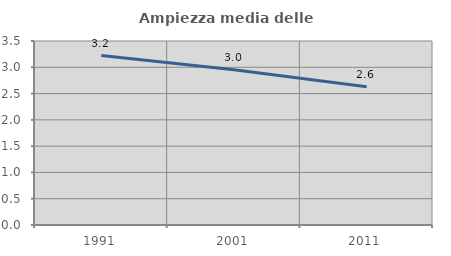
| Category | Ampiezza media delle famiglie |
|---|---|
| 1991.0 | 3.223 |
| 2001.0 | 2.951 |
| 2011.0 | 2.628 |